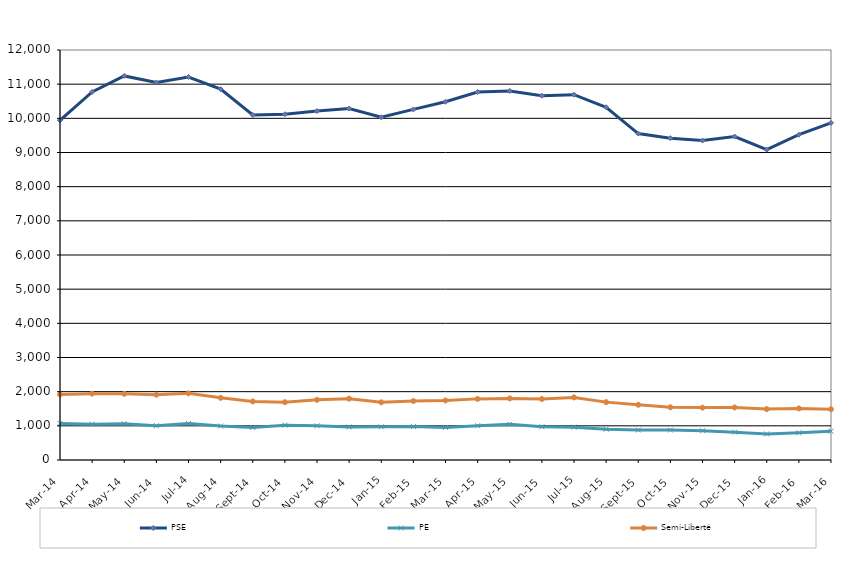
| Category | PSE | PE | Semi-Liberté |
|---|---|---|---|
| 2014-03-01 | 9943 | 1071 | 1920 |
| 2014-04-01 | 10773 | 1050 | 1942 |
| 2014-05-01 | 11241 | 1062 | 1937 |
| 2014-06-01 | 11048 | 1005 | 1912 |
| 2014-07-01 | 11210 | 1068 | 1951 |
| 2014-08-01 | 10856 | 992 | 1820 |
| 2014-09-01 | 10098 | 951 | 1714 |
| 2014-10-01 | 10120 | 1018 | 1692 |
| 2014-11-01 | 10213 | 1000 | 1760 |
| 2014-12-01 | 10287 | 966 | 1794 |
| 2015-01-01 | 10030 | 970 | 1689 |
| 2015-02-01 | 10261 | 977 | 1726 |
| 2015-03-01 | 10485 | 954 | 1742 |
| 2015-04-01 | 10770 | 1003 | 1789 |
| 2015-05-01 | 10801 | 1043 | 1803 |
| 2015-06-01 | 10662 | 973 | 1785 |
| 2015-07-01 | 10692 | 961 | 1832 |
| 2015-08-01 | 10325 | 903 | 1694 |
| 2015-09-01 | 9555 | 878 | 1616 |
| 2015-10-01 | 9420 | 877 | 1542 |
| 2015-11-01 | 9350 | 859 | 1533 |
| 2015-12-01 | 9466 | 815 | 1539 |
| 2016-01-01 | 9081 | 764 | 1490 |
| 2016-02-01 | 9521 | 798 | 1510 |
| 2016-03-01 | 9868 | 845 | 1486 |